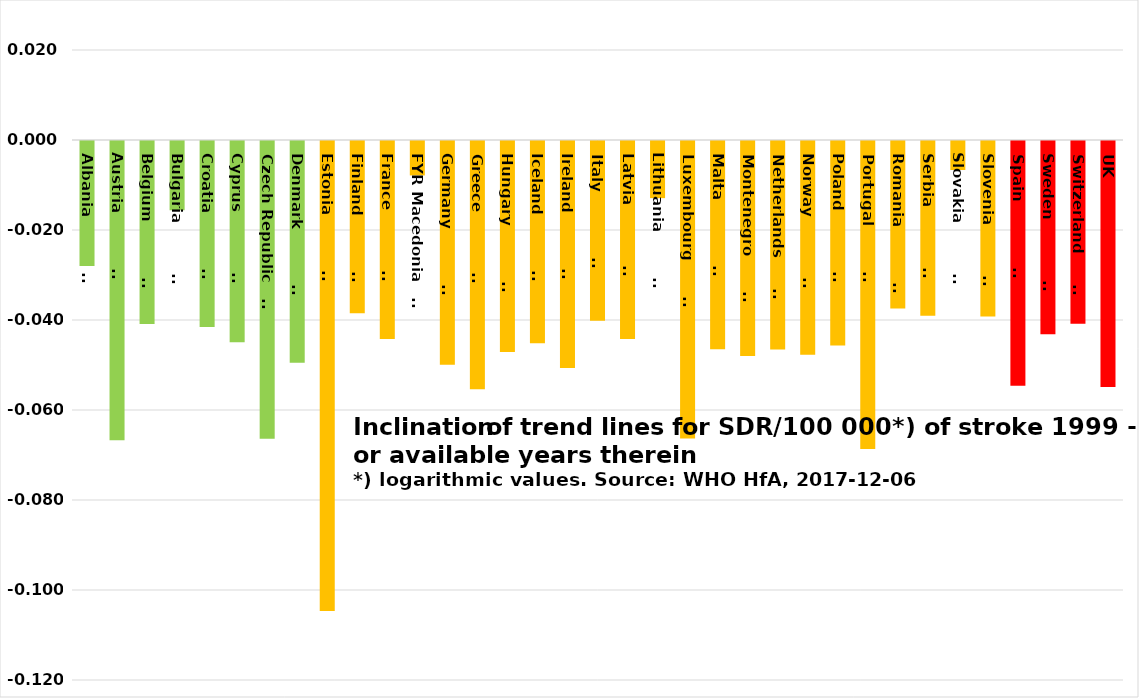
| Category | Series 0 |
|---|---|
| Albania                | -0.028 |
| Austria                | -0.067 |
| Belgium                | -0.041 |
| Bulgaria               | -0.015 |
| Croatia                | -0.041 |
| Cyprus                 | -0.045 |
| Czech Republic         | -0.066 |
| Denmark                | -0.049 |
| Estonia                | -0.104 |
| Finland                | -0.038 |
| France                 | -0.044 |
| FYR Macedonia         | -0.008 |
| Germany                | -0.05 |
| Greece                 | -0.055 |
| Hungary                | -0.047 |
| Iceland                | -0.045 |
| Ireland                | -0.05 |
| Italy                  | -0.04 |
| Latvia                 | -0.044 |
| Lithuania              | -0.013 |
| Luxembourg             | -0.066 |
| Malta                  | -0.046 |
| Montenegro             | -0.048 |
| Netherlands            | -0.046 |
| Norway                 | -0.048 |
| Poland                 | -0.045 |
| Portugal               | -0.068 |
| Romania                | -0.037 |
| Serbia                 | -0.039 |
| Slovakia               | -0.006 |
| Slovenia               | -0.039 |
| Spain                  | -0.054 |
| Sweden                 | -0.043 |
| Switzerland            | -0.041 |
| UK | -0.055 |